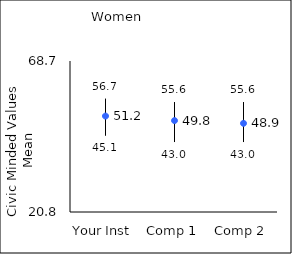
| Category | 25th percentile | 75th percentile | Mean |
|---|---|---|---|
| Your Inst | 45.1 | 56.7 | 51.23 |
| Comp 1 | 43 | 55.6 | 49.8 |
| Comp 2 | 43 | 55.6 | 48.93 |